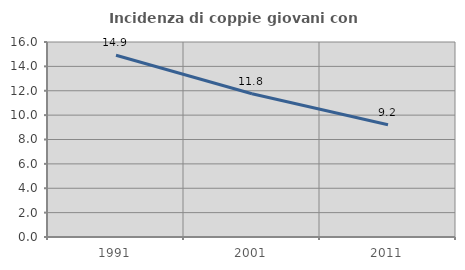
| Category | Incidenza di coppie giovani con figli |
|---|---|
| 1991.0 | 14.912 |
| 2001.0 | 11.759 |
| 2011.0 | 9.209 |